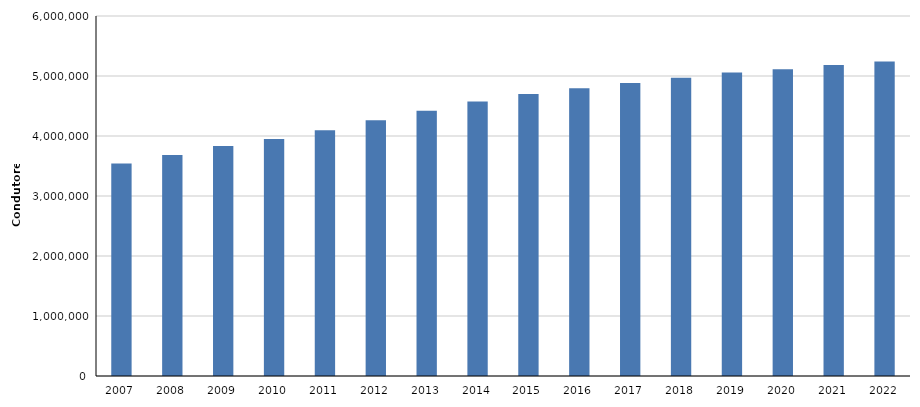
| Category | Condutores |
|---|---|
| 2007 | 3539613 |
| 2008 | 3682350 |
| 2009 | 3831983 |
| 2010 | 3948573 |
| 2011 | 4094720 |
| 2012 | 4263824 |
| 2013 | 4419160 |
| 2014 | 4576292 |
| 2015 | 4698831 |
| 2016 | 4794438 |
| 2017 | 4883070 |
| 2018 | 4970737 |
| 2019 | 5060058 |
| 2020 | 5113756 |
| 2021 | 5184621 |
| 2022 | 5240901 |